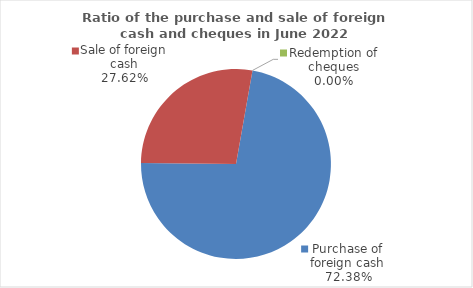
| Category | Series 0 |
|---|---|
| Purchase of foreign cash | 72.381 |
| Sale of foreign cash | 27.619 |
| Redemption of cheques | 0 |